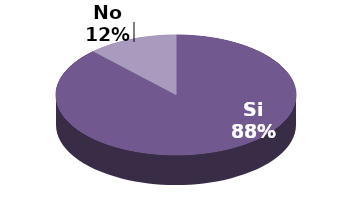
| Category | Series 1 |
|---|---|
| Si | 29 |
| No | 4 |